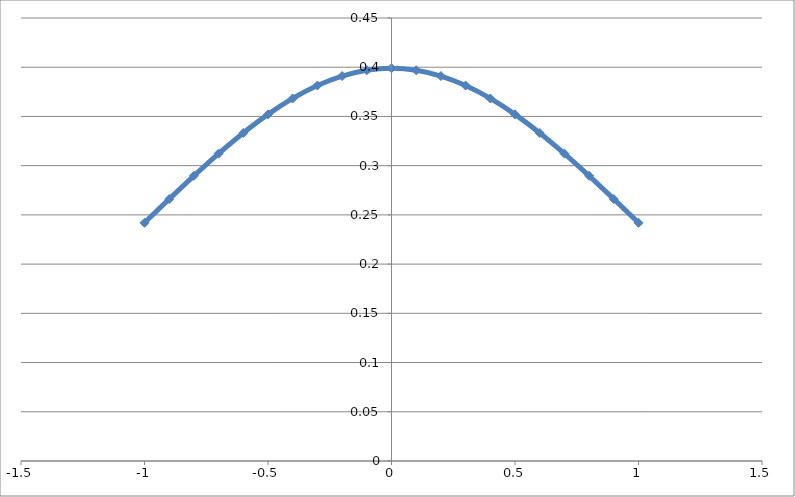
| Category | Series 0 |
|---|---|
| -1.0 | 0.242 |
| -0.9 | 0.266 |
| -0.8 | 0.29 |
| -0.7 | 0.312 |
| -0.6 | 0.333 |
| -0.5 | 0.352 |
| -0.4 | 0.368 |
| -0.3 | 0.381 |
| -0.2 | 0.391 |
| -0.1 | 0.397 |
| -1.38777878078145e-16 | 0.399 |
| 0.0999999999999998 | 0.397 |
| 0.2 | 0.391 |
| 0.3 | 0.381 |
| 0.4 | 0.368 |
| 0.5 | 0.352 |
| 0.6 | 0.333 |
| 0.7 | 0.312 |
| 0.8 | 0.29 |
| 0.9 | 0.266 |
| 1.0 | 0.242 |